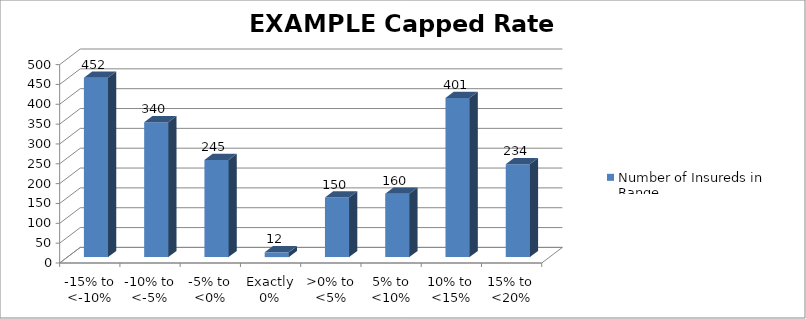
| Category | Number of Insureds in Range |
|---|---|
| -15% to <-10% | 452 |
| -10% to <-5% | 340 |
| -5% to <0% | 245 |
| Exactly 0% | 12 |
| >0% to <5% | 150 |
| 5% to <10% | 160 |
| 10% to <15% | 401 |
| 15% to <20% | 234 |